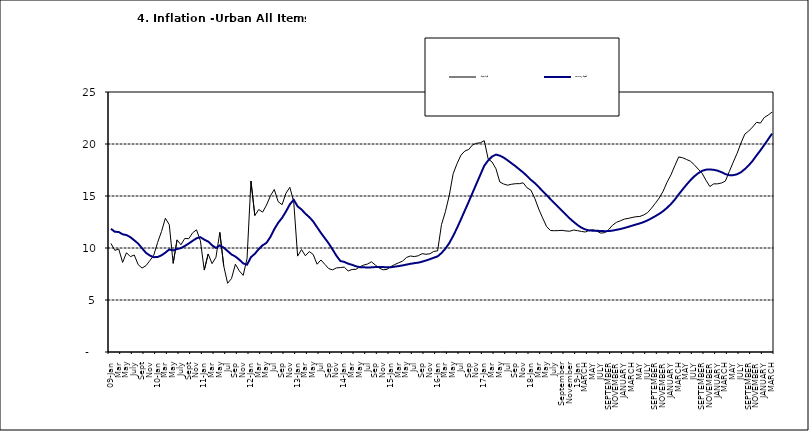
| Category | Year-on Rate | 12-Month Average |
|---|---|---|
| 09-Jan | 10.439 | 11.844 |
| Feb | 9.772 | 11.562 |
| Mar | 9.907 | 11.538 |
| Apr | 8.618 | 11.319 |
| May | 9.547 | 11.246 |
| June | 9.17 | 11.039 |
| July | 9.325 | 10.738 |
| Aug | 8.401 | 10.424 |
| Sept | 8.07 | 9.973 |
| Oct | 8.3 | 9.535 |
| Nov | 8.781 | 9.278 |
| Dec | 9.298 | 9.117 |
| 10-Jan | 10.534 | 9.136 |
| Feb | 11.584 | 9.297 |
| Mar | 12.864 | 9.555 |
| Apr | 12.24 | 9.859 |
| May | 8.524 | 9.769 |
| June | 10.781 | 9.904 |
| July | 10.313 | 9.987 |
| Aug | 10.924 | 10.197 |
| Sept | 10.891 | 10.43 |
| Oct | 11.457 | 10.689 |
| Nov | 11.748 | 10.932 |
| Dec | 10.699 | 11.042 |
| 11-Jan | 7.878 | 10.806 |
| Feb | 9.426 | 10.623 |
| Mar | 8.498 | 10.26 |
| Apr | 9.11 | 10.005 |
| May | 11.5 | 10.249 |
| Jun | 8.278 | 10.034 |
| Jul | 6.608 | 9.711 |
| Aug | 7.061 | 9.38 |
| Sep | 8.443 | 9.178 |
| Oct | 7.802 | 8.88 |
| Nov | 7.365 | 8.525 |
| Dec | 8.993 | 8.395 |
| 12-Jan | 16.445 | 9.119 |
| Feb | 13.123 | 9.443 |
| Mar | 13.701 | 9.889 |
| Apr | 13.447 | 10.259 |
| May | 14.127 | 10.496 |
| Jun | 15.012 | 11.062 |
| Jul | 15.63 | 11.81 |
| Aug | 14.456 | 12.422 |
| Sep | 14.162 | 12.893 |
| Oct | 15.26 | 13.506 |
| Nov | 15.836 | 14.199 |
| Dec | 14.459 | 14.637 |
| 13-Jan | 9.22 | 14.006 |
| Feb | 9.85 | 13.703 |
| Mar | 9.253 | 13.302 |
| Apr | 9.657 | 12.966 |
| May | 9.385 | 12.557 |
| Jun | 8.441 | 11.999 |
| Jul | 8.849 | 11.443 |
| Aug | 8.431 | 10.946 |
| Sep | 8.013 | 10.44 |
| Oct | 7.9 | 9.849 |
| Nov | 8.086 | 9.245 |
| Dec | 8.117 | 8.75 |
| 14-Jan | 8.164 | 8.662 |
| Feb | 7.791 | 8.493 |
| Mar | 7.937 | 8.384 |
| Apr | 7.947 | 8.246 |
| May | 8.195 | 8.151 |
| Jun | 8.358 | 8.146 |
| Jul | 8.464 | 8.118 |
| Aug | 8.673 | 8.141 |
| Sep | 8.357 | 8.17 |
| Oct | 8.064 | 8.182 |
| Nov | 7.902 | 8.165 |
| Dec | 7.948 | 8.151 |
| 15-Jan | 8.211 | 8.155 |
| Feb | 8.412 | 8.206 |
| Mar | 8.579 | 8.26 |
| Apr | 8.742 | 8.326 |
| May | 9.092 | 8.403 |
| Jun | 9.232 | 8.478 |
| Jul | 9.177 | 8.54 |
| Aug | 9.25 | 8.591 |
| Sep | 9.455 | 8.684 |
| Oct | 9.398 | 8.795 |
| Nov | 9.442 | 8.922 |
| Dec | 9.665 | 9.064 |
| 16-Jan | 9.728 | 9.19 |
| Feb | 12.254 | 9.516 |
| Mar | 13.485 | 9.935 |
| Apr | 15.052 | 10.474 |
| May | 17.148 | 11.165 |
| Jun | 18.111 | 11.925 |
| Jul | 18.927 | 12.754 |
| Aug | 19.325 | 13.605 |
| Sep | 19.476 | 14.444 |
| Oct | 19.914 | 15.318 |
| Nov | 20.067 | 16.193 |
| Dec | 20.118 | 17.05 |
| 17-Jan | 20.315 | 17.914 |
| Feb | 18.569 | 18.418 |
| Mar | 18.27 | 18.794 |
| Apr | 17.621 | 18.982 |
| May | 16.343 | 18.883 |
| Jun | 16.153 | 18.692 |
| Jul | 16.038 | 18.43 |
| Aug | 16.128 | 18.151 |
| Sep | 16.183 | 17.872 |
| Oct | 16.187 | 17.567 |
| Nov | 16.267 | 17.264 |
| Dec | 15.785 | 16.921 |
| 18-Jan | 15.559 | 16.55 |
| Feb | 14.763 | 16.241 |
| Mar | 13.748 | 15.866 |
| Apr | 12.893 | 15.468 |
| May | 12.077 | 15.096 |
| June | 11.683 | 14.706 |
| July | 11.661 | 14.329 |
| August | 11.673 | 13.951 |
| September | 11.697 | 13.578 |
| October | 11.64 | 13.206 |
| November | 11.615 | 12.831 |
| December | 11.731 | 12.509 |
| 19-Jan | 11.664 | 12.203 |
| February | 11.592 | 11.954 |
| MARCH | 11.535 | 11.78 |
| APRIL | 11.696 | 11.686 |
| MAY | 11.756 | 11.662 |
| JUNE | 11.605 | 11.655 |
| JULY | 11.432 | 11.635 |
| AUGUST | 11.479 | 11.618 |
| SEPTEMBER | 11.776 | 11.626 |
| OCTOBER | 12.202 | 11.676 |
| NOVEMBER | 12.469 | 11.75 |
| DECEMBER | 12.617 | 11.827 |
| JANUARY | 12.779 | 11.923 |
| FEBRUARY | 12.847 | 12.03 |
| MARCH | 12.932 | 12.147 |
| APRIL | 13.008 | 12.258 |
| MAY | 13.033 | 12.365 |
| JUNE | 13.178 | 12.496 |
| JULY | 13.403 | 12.659 |
| AUGUST | 13.827 | 12.855 |
| SEPTEMBER | 14.306 | 13.068 |
| OCTOBER | 14.811 | 13.289 |
| NOVEMBER | 15.466 | 13.546 |
| DECEMBER | 16.327 | 13.864 |
| JANUARY | 17.03 | 14.228 |
| FEBRUARY | 17.918 | 14.66 |
| MARCH | 18.756 | 15.154 |
| APRIL | 18.675 | 15.63 |
| MAY | 18.514 | 16.086 |
| JUNE | 18.348 | 16.512 |
| JULY | 18.007 | 16.886 |
| AUGUST | 17.59 | 17.187 |
| SEPTEMBER | 17.187 | 17.411 |
| OCTOBER | 16.52 | 17.534 |
| NOVEMBER | 15.916 | 17.55 |
| DECEMBER | 16.165 | 17.519 |
| JANUARY | 16.171 | 17.435 |
| FEBRUARY | 16.253 | 17.292 |
| MARCH | 16.438 | 17.103 |
| APRIL | 17.347 | 17.005 |
| MAY | 18.24 | 17.002 |
| JUNE | 19.093 | 17.087 |
| JULY | 20.087 | 17.285 |
| AUGUST | 20.954 | 17.588 |
| SEPTEMBER | 21.251 | 17.944 |
| OCTOBER | 21.632 | 18.379 |
| NOVEMBER | 22.086 | 18.896 |
| DECEMBER | 22.011 | 19.382 |
| JANUARY | 22.548 | 19.912 |
| FEBRUARY | 22.782 | 20.451 |
| MARCH | 23.072 | 20.998 |